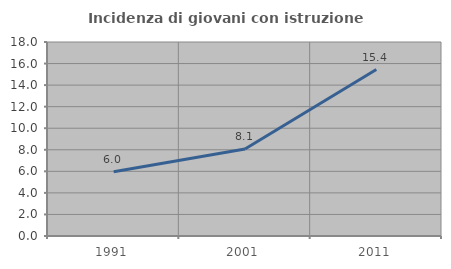
| Category | Incidenza di giovani con istruzione universitaria |
|---|---|
| 1991.0 | 5.96 |
| 2001.0 | 8.074 |
| 2011.0 | 15.446 |